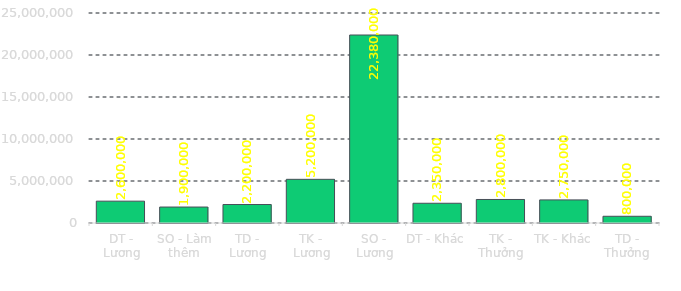
| Category | Total |
|---|---|
| DT - Lương | 2600000 |
| SO - Làm thêm | 1900000 |
| TD - Lương | 2200000 |
| TK - Lương | 5200000 |
| SO - Lương | 22380000 |
| DT - Khác | 2350000 |
| TK - Thưởng | 2800000 |
| TK - Khác | 2750000 |
| TD - Thưởng | 800000 |